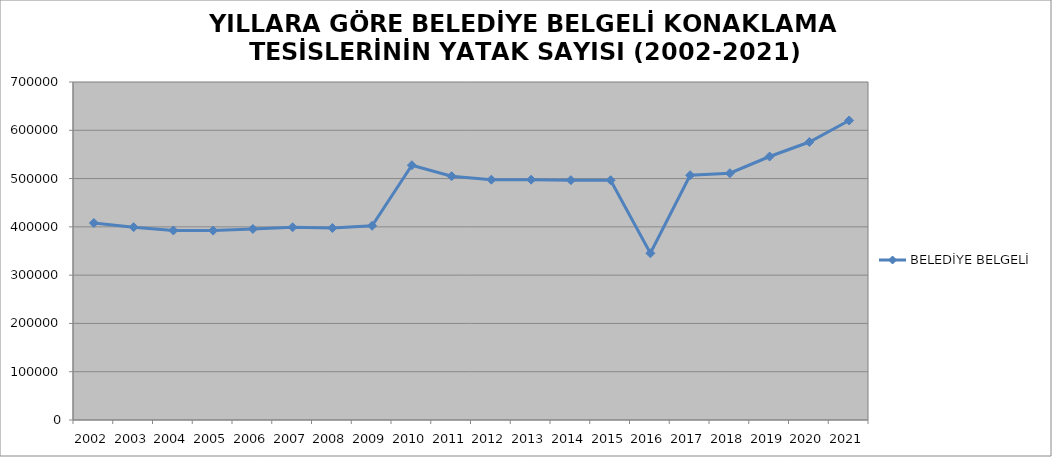
| Category | BELEDİYE BELGELİ |
|---|---|
| 2002 | 408005 |
| 2003 | 399369 |
| 2004 | 392582 |
| 2005 | 392338 |
| 2006 | 395671 |
| 2007 | 399110 |
| 2008 | 397684 |
| 2009 | 402289 |
| 2010 | 527712 |
| 2011 | 504877 |
| 2012 | 497728 |
| 2013 | 497728 |
| 2014 | 496697 |
| 2015 | 496574 |
| 2016 | 345267 |
| 2017 | 506934 |
| 2018 | 511076 |
| 2019 | 545669 |
| 2020 | 575682 |
| 2021 | 620349 |